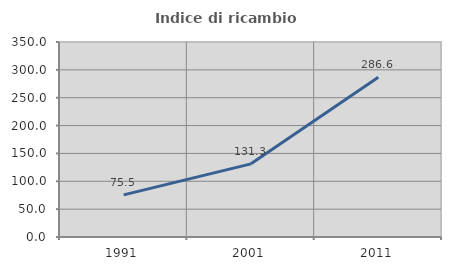
| Category | Indice di ricambio occupazionale  |
|---|---|
| 1991.0 | 75.542 |
| 2001.0 | 131.304 |
| 2011.0 | 286.635 |